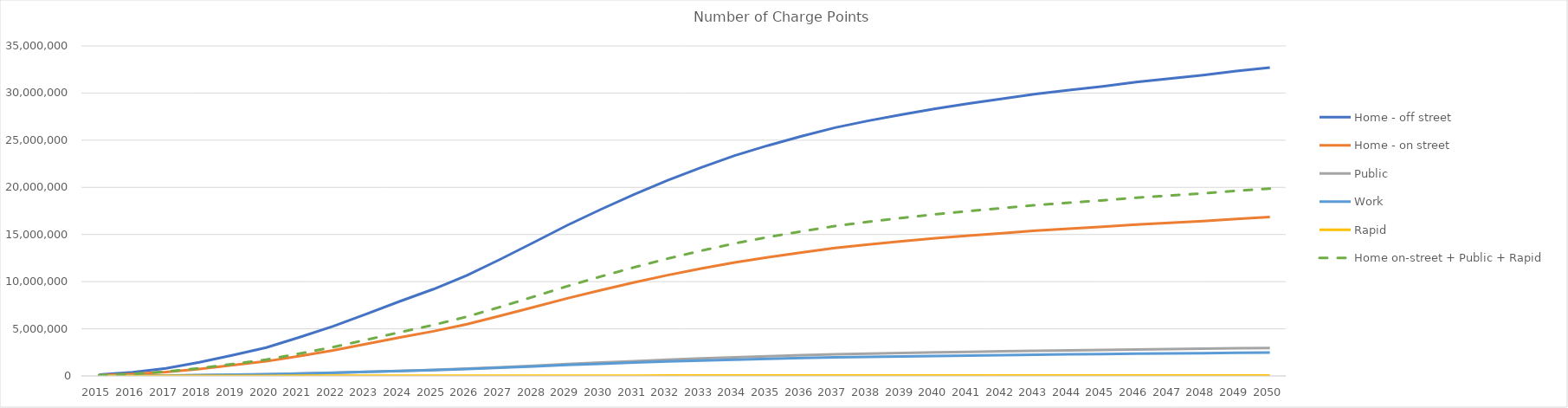
| Category | Home - off street | Home - on street | Public | Work | Rapid | Home on-street + Public + Rapid |
|---|---|---|---|---|---|---|
| 2015.0 | 138152.52 | 71169.48 | 4080 | 7000 | 1754 | 77003.48 |
| 2016.0 | 382620.48 | 197107.52 | 13933 | 20709 | 2872 | 213912.52 |
| 2017.0 | 810276.06 | 417414.94 | 34430 | 46268 | 4514 | 456358.94 |
| 2018.0 | 1440721.92 | 742190.08 | 68912 | 85672 | 6487 | 817589.08 |
| 2019.0 | 2211270.6 | 1139139.4 | 115510 | 135616 | 8464 | 1263113.4 |
| 2020.0 | 3011897.46 | 1551583.54 | 167655 | 187814 | 10092 | 1729330.54 |
| 2021.0 | 4113512.04 | 2119081.96 | 244136 | 262927 | 12379 | 2375596.96 |
| 2022.0 | 5273261.4 | 2716528.6 | 329368 | 344369 | 14505 | 3060401.6 |
| 2023.0 | 6584874.78 | 3392208.22 | 430516 | 436831 | 16208 | 3838932.22 |
| 2024.0 | 7923478.2 | 4081791.8 | 538130 | 533170 | 17690 | 4637611.8 |
| 2025.0 | 9207265.32 | 4743136.68 | 644932 | 624057 | 18620 | 5406688.68 |
| 2026.0 | 10666112.82 | 5494664.18 | 770063 | 735866 | 21360 | 6286087.18 |
| 2027.0 | 12379309.8 | 6377220.2 | 921554 | 872717 | 24184 | 7322958.2 |
| 2028.0 | 14171479.08 | 7300458.92 | 1084715 | 1014572 | 26899 | 8412072.92 |
| 2029.0 | 15984843.6 | 8234616.4 | 1254191 | 1161033 | 29427 | 9518234.4 |
| 2030.0 | 17659732.2 | 9097437.8 | 1414294 | 1294446 | 31659 | 10543390.8 |
| 2031.0 | 19258522.8 | 9921057.2 | 1570071 | 1416327 | 33696 | 11524824.2 |
| 2032.0 | 20753361.42 | 10691125.58 | 1718153 | 1532586 | 35533 | 12444811.58 |
| 2033.0 | 22106039.34 | 11387959.66 | 1854061 | 1637086 | 37150 | 13279170.66 |
| 2034.0 | 23363495.76 | 12035740.24 | 1981948 | 1731640 | 38600 | 14056288.24 |
| 2035.0 | 24441329.22 | 12590987.78 | 2092703 | 1819467 | 39816 | 14723506.78 |
| 2036.0 | 25418819.58 | 13094543.42 | 2194021 | 1896355 | 40875 | 15329439.42 |
| 2037.0 | 26331948.72 | 13564943.28 | 2289395 | 1963877 | 41814 | 15896152.28 |
| 2038.0 | 27064229.28 | 13942178.72 | 2366374 | 2024453 | 42549 | 16351101.72 |
| 2039.0 | 27717487.38 | 14278705.62 | 2435409 | 2076359 | 43174 | 16757288.62 |
| 2040.0 | 28338192.96 | 14598463.04 | 2501314 | 2121425 | 43738 | 17143515.04 |
| 2041.0 | 28888372.92 | 14881889.08 | 2559980 | 2168677 | 44219 | 17486088.08 |
| 2042.0 | 29389047.6 | 15139812.4 | 2613568 | 2211085 | 44641 | 17798021.4 |
| 2043.0 | 29903750.58 | 15404962.42 | 2668853 | 2250215 | 45059 | 18118874.42 |
| 2044.0 | 30309430.8 | 15613949.2 | 2712566 | 2287402 | 45384 | 18371899.2 |
| 2045.0 | 30705688.2 | 15818081.8 | 2755380 | 2322488 | 45694 | 18619155.8 |
| 2046.0 | 31155007.62 | 16049549.38 | 2804065 | 2356500 | 46038 | 18899652.38 |
| 2047.0 | 31525674.84 | 16240499.16 | 2844337 | 2390131 | 46319 | 19131155.16 |
| 2048.0 | 31894725.06 | 16430615.94 | 2884530 | 2422829 | 46596 | 19361741.94 |
| 2049.0 | 32331913.68 | 16655834.32 | 2932267 | 2455395 | 46921 | 19635022.32 |
| 2050.0 | 32708802.06 | 16849988.94 | 2973527 | 2487937 | 47198 | 19870713.94 |